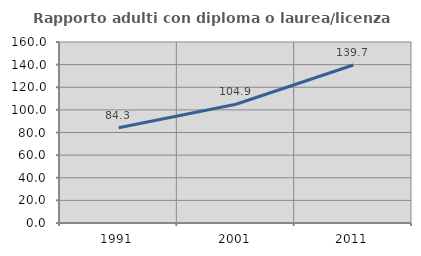
| Category | Rapporto adulti con diploma o laurea/licenza media  |
|---|---|
| 1991.0 | 84.253 |
| 2001.0 | 104.932 |
| 2011.0 | 139.675 |